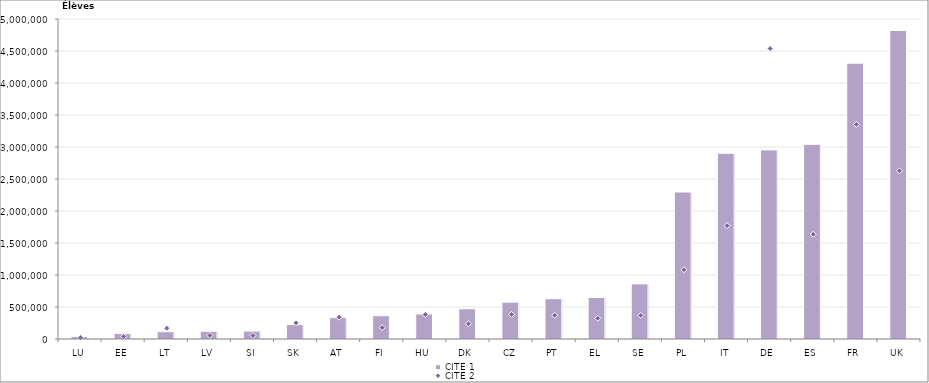
| Category | CITE 1 |
|---|---|
| LU | 37452 |
| EE | 85617 |
| LT | 113881 |
| LV | 121506 |
| SI | 123998 |
| SK | 225427 |
| AT | 334933 |
| FI | 363990 |
| HU | 390970 |
| DK | 472523 |
| CZ | 575980 |
| PT | 629804 |
| EL | 649246 |
| SE | 861086 |
| PL | 2296529 |
| IT | 2902379 |
| DE | 2954775 |
| ES | 3042396 |
| FR | 4309942 |
| UK | 4820283 |